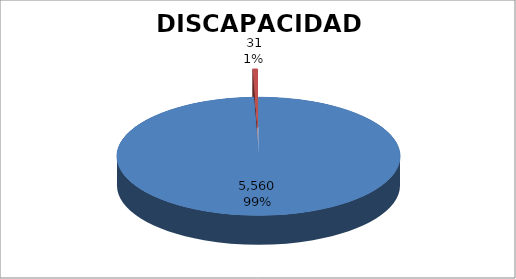
| Category | DISCAPACIDAD INTELECTUAL |
|---|---|
| 0 | 5560 |
| 1 | 31 |